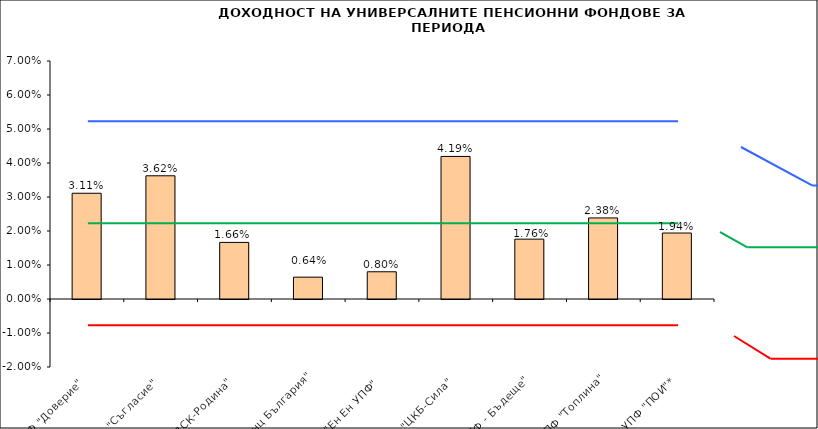
| Category | Series 0 |
|---|---|
| УПФ "Доверие"  | 0.031 |
| УПФ "Съгласие"  | 0.036 |
| УПФ "ДСК-Родина"  | 0.017 |
| "ЗУПФ Алианц България" | 0.006 |
| "Eн Ен УПФ"  | 0.008 |
| УПФ "ЦКБ-Сила"  | 0.042 |
| "УПФ - Бъдеще" | 0.018 |
| УПФ "Топлина" | 0.024 |
| УПФ "ПОИ"* | 0.019 |